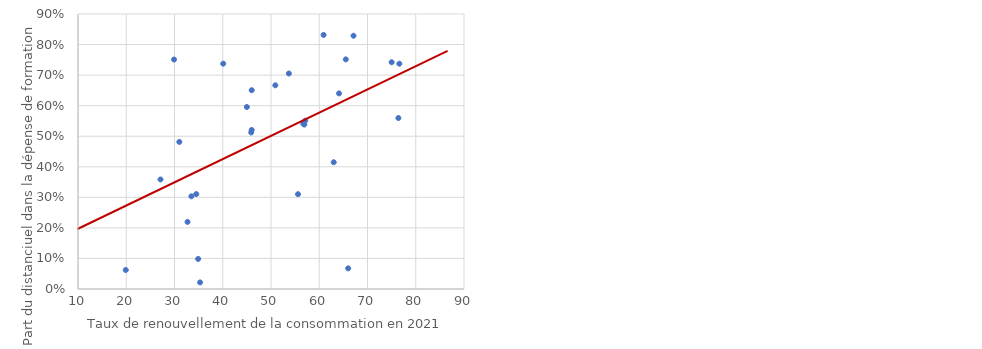
| Category | Part distanciel 2021 |
|---|---|
| 65.5 | 0.752 |
| 34.9 | 0.098 |
| 75.0 | 0.742 |
| 67.1 | 0.829 |
| 19.9 | 0.062 |
| 60.9 | 0.832 |
| 33.5 | 0.303 |
| 55.6 | 0.31 |
| 45.0 | 0.596 |
| 56.9 | 0.538 |
| 46.0 | 0.651 |
| 35.3 | 0.022 |
| 45.9 | 0.512 |
| 76.6 | 0.737 |
| 40.1 | 0.737 |
| 27.1 | 0.359 |
| 56.7 | 0.541 |
| 29.9 | 0.751 |
| 32.7 | 0.22 |
| 34.5 | 0.311 |
| 63.0 | 0.415 |
| 46.0 | 0.521 |
| 76.4 | 0.56 |
| 53.7 | 0.705 |
| 31.0 | 0.481 |
| 50.9 | 0.667 |
| 57.1 | 0.551 |
| 66.0 | 0.068 |
| 64.1 | 0.64 |